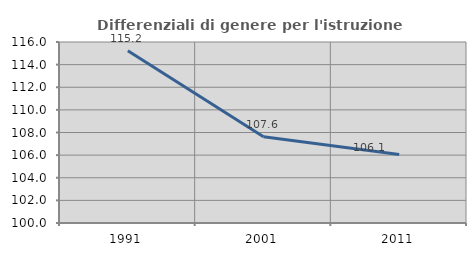
| Category | Differenziali di genere per l'istruzione superiore |
|---|---|
| 1991.0 | 115.219 |
| 2001.0 | 107.621 |
| 2011.0 | 106.063 |